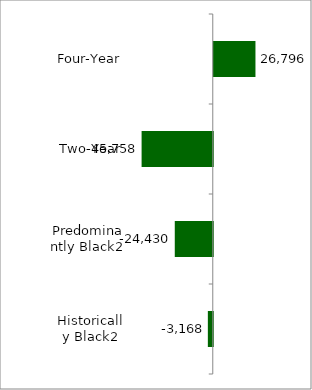
| Category | State |
|---|---|
| Four-Year | 26796 |
| Two-Year | -45758 |
| Predominantly Black2 | -24430 |
| Historically Black2 | -3168 |